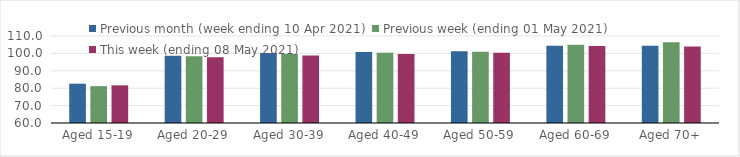
| Category | Previous month (week ending 10 Apr 2021) | Previous week (ending 01 May 2021) | This week (ending 08 May 2021) |
|---|---|---|---|
| Aged 15-19 | 82.59 | 81.18 | 81.65 |
| Aged 20-29 | 98.67 | 98.4 | 97.75 |
| Aged 30-39 | 100.27 | 99.6 | 98.8 |
| Aged 40-49 | 100.83 | 100.4 | 99.61 |
| Aged 50-59 | 101.22 | 100.99 | 100.31 |
| Aged 60-69 | 104.34 | 104.93 | 104.21 |
| Aged 70+ | 104.41 | 106.44 | 103.9 |